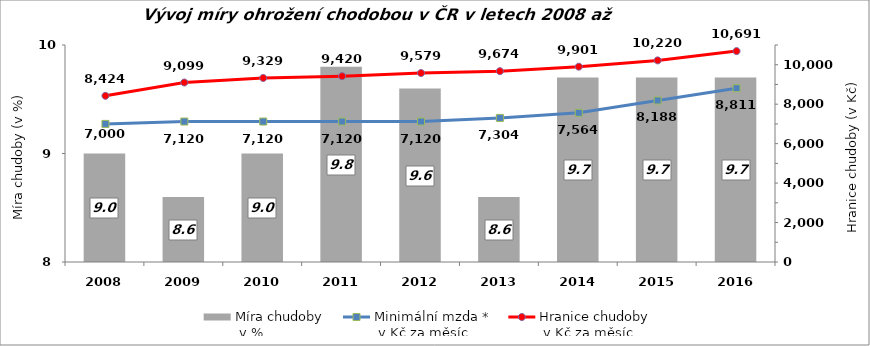
| Category | Míra chudoby
 v % |
|---|---|
| 2008.0 | 9 |
| 2009.0 | 8.6 |
| 2010.0 | 9 |
| 2011.0 | 9.8 |
| 2012.0 | 9.6 |
| 2013.0 | 8.6 |
| 2014.0 | 9.7 |
| 2015.0 | 9.7 |
| 2016.0 | 9.7 |